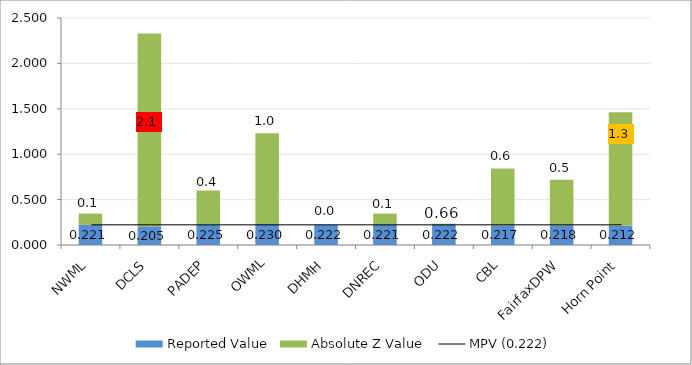
| Category | Reported Value | Absolute Z Value  |
|---|---|---|
| NWML | 0.221 | 0.125 |
| DCLS | 0.205 | 2.125 |
| PADEP | 0.225 | 0.375 |
| OWML | 0.23 | 1 |
| DHMH | 0.222 | 0 |
| DNREC | 0.221 | 0.125 |
| ODU | 0.222 | 0.013 |
| CBL | 0.217 | 0.625 |
| FairfaxDPW | 0.218 | 0.5 |
| Horn Point | 0.212 | 1.25 |